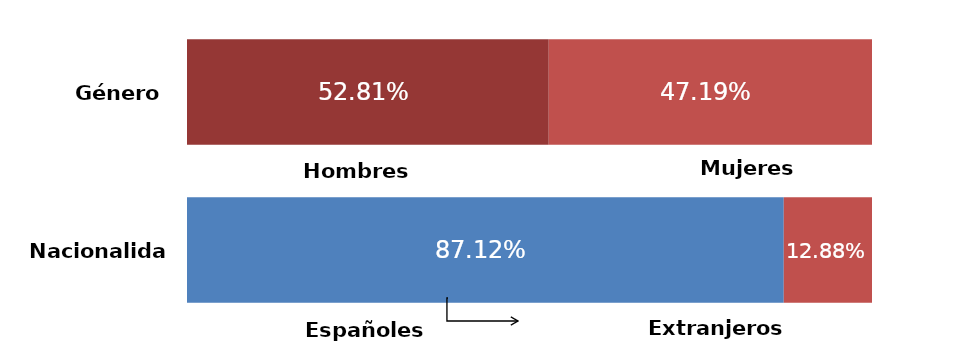
| Category | Series 0 | Series 1 |
|---|---|---|
| 0 | 0.528 | 0.472 |
| 1 | 0.871 | 0.129 |